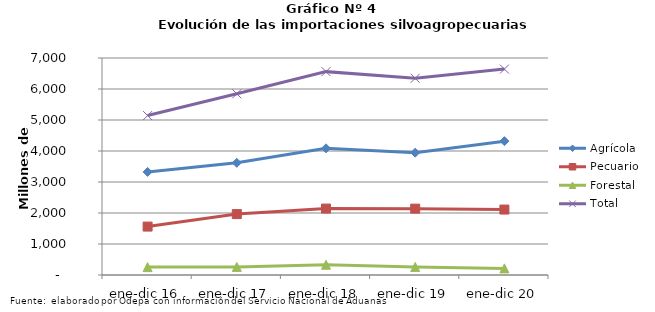
| Category | Agrícola | Pecuario | Forestal | Total |
|---|---|---|---|---|
| ene-dic 16 | 3325911 | 1562037 | 254803 | 5142751 |
| ene-dic 17 | 3619177 | 1965208 | 260608 | 5844993 |
| ene-dic 18 | 4085984 | 2142776 | 331427 | 6560187 |
| ene-dic 19 | 3945179 | 2140240 | 260080 | 6345499 |
| ene-dic 20 | 4317954 | 2111130 | 213653 | 6642737 |